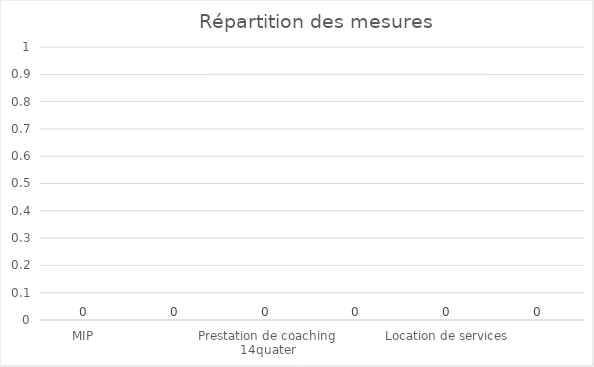
| Category | Series 0 |
|---|---|
| MIP | 0 |
| Prestation de coaching IP | 0 |
| Prestation de coaching 14quater | 0 |
| Entraînement progressif | 0 |
| Location de services | 0 |
| Autres mesures d'instruction | 0 |